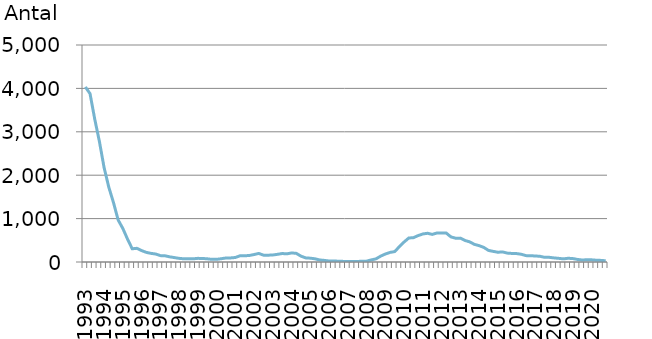
| Category | Antal overtagne ejerboliger  |
|---|---|
| 1993.0 | 4034 |
| nan | 3879 |
| nan | 3294 |
| nan | 2776 |
| 1994.0 | 2175 |
| nan | 1725 |
| nan | 1370 |
| nan | 968 |
| 1995.0 | 772 |
| nan | 527 |
| nan | 305 |
| nan | 315 |
| 1996.0 | 263 |
| nan | 222 |
| nan | 199 |
| nan | 184 |
| 1997.0 | 147 |
| nan | 143 |
| nan | 119 |
| nan | 102 |
| 1998.0 | 84 |
| nan | 74 |
| nan | 77 |
| nan | 73 |
| 1999.0 | 84 |
| nan | 81 |
| nan | 74 |
| nan | 61 |
| 2000.0 | 61 |
| nan | 76 |
| nan | 92 |
| nan | 94 |
| 2001.0 | 104 |
| nan | 143 |
| nan | 144 |
| nan | 150 |
| 2002.0 | 172 |
| nan | 197 |
| nan | 158 |
| nan | 157 |
| 2003.0 | 162 |
| nan | 177 |
| nan | 195 |
| nan | 188 |
| 2004.0 | 209 |
| nan | 199 |
| nan | 135 |
| nan | 95 |
| 2005.0 | 88 |
| nan | 73 |
| nan | 47 |
| nan | 37 |
| 2006.0 | 23 |
| nan | 22 |
| nan | 19 |
| nan | 14 |
| 2007.0 | 9 |
| nan | 11 |
| nan | 13 |
| nan | 16 |
| 2008.0 | 20 |
| nan | 48 |
| nan | 72 |
| nan | 135 |
| 2009.0 | 184 |
| nan | 221 |
| nan | 240 |
| nan | 355 |
| 2010.0 | 461 |
| nan | 553 |
| nan | 561 |
| nan | 609 |
| 2011.0 | 646 |
| nan | 662 |
| nan | 636 |
| nan | 668 |
| 2012.0 | 669 |
| nan | 666 |
| nan | 578 |
| nan | 548 |
| 2013.0 | 550 |
| nan | 496 |
| nan | 464 |
| nan | 406 |
| 2014.0 | 377 |
| nan | 336 |
| nan | 267 |
| nan | 245 |
| 2015.0 | 225 |
| nan | 232 |
| nan | 205 |
| nan | 197 |
| 2016.0 | 194 |
| nan | 178 |
| nan | 147 |
| nan | 144 |
| 2017.0 | 139 |
| nan | 131 |
| nan | 107 |
| nan | 107 |
| 2018.0 | 94 |
| nan | 84 |
| nan | 72 |
| nan | 86 |
| 2019.0 | 79 |
| nan | 59 |
| nan | 46 |
| nan | 52 |
| 2020.0 | 50 |
| nan | 41 |
| nan | 37 |
| nan | 28 |